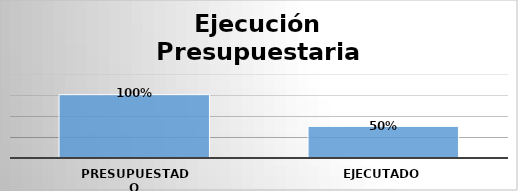
| Category | Series 0 |
|---|---|
| Presupuestado | 30155201108 |
| Ejecutado | 15054893926 |